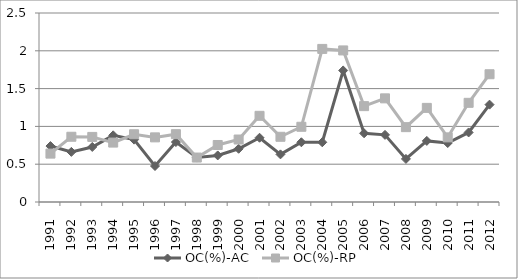
| Category | OC(%)-AC | OC(%)-RP |
|---|---|---|
| 1991.0 | 0.74 | 0.64 |
| 1992.0 | 0.663 | 0.863 |
| 1993.0 | 0.728 | 0.861 |
| 1994.0 | 0.882 | 0.786 |
| 1995.0 | 0.825 | 0.896 |
| 1996.0 | 0.476 | 0.855 |
| 1997.0 | 0.793 | 0.898 |
| 1998.0 | 0.588 | 0.588 |
| 1999.0 | 0.616 | 0.754 |
| 2000.0 | 0.704 | 0.826 |
| 2001.0 | 0.85 | 1.14 |
| 2002.0 | 0.63 | 0.862 |
| 2003.0 | 0.79 | 0.995 |
| 2004.0 | 0.79 | 2.025 |
| 2005.0 | 1.74 | 2.005 |
| 2006.0 | 0.909 | 1.268 |
| 2007.0 | 0.888 | 1.371 |
| 2008.0 | 0.57 | 0.99 |
| 2009.0 | 0.808 | 1.245 |
| 2010.0 | 0.78 | 0.855 |
| 2011.0 | 0.92 | 1.312 |
| 2012.0 | 1.288 | 1.69 |